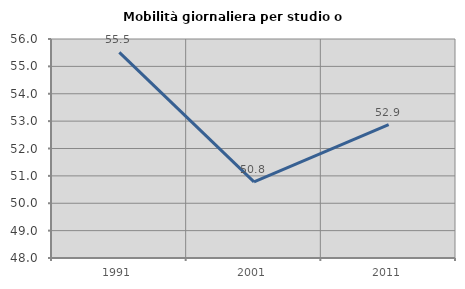
| Category | Mobilità giornaliera per studio o lavoro |
|---|---|
| 1991.0 | 55.512 |
| 2001.0 | 50.78 |
| 2011.0 | 52.869 |